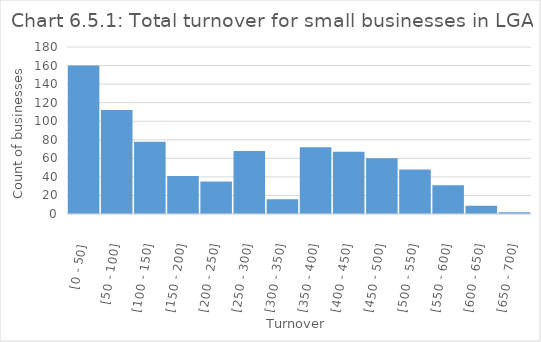
| Category | Series 0 |
|---|---|
| [0 - 50] | 160 |
| [50 - 100] | 112 |
| [100 - 150] | 78 |
| [150 - 200] | 41 |
| [200 - 250] | 35 |
| [250 - 300] | 68 |
| [300 - 350] | 16 |
| [350 - 400] | 72 |
| [400 - 450] | 67 |
| [450 - 500] | 60 |
| [500 - 550] | 48 |
| [550 - 600] | 31 |
| [600 - 650] | 9 |
| [650 - 700] | 2 |